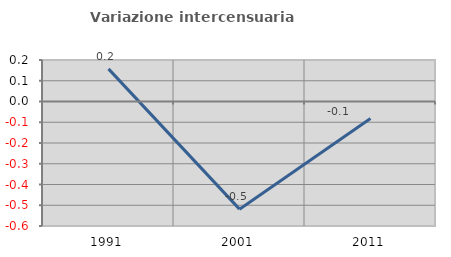
| Category | Variazione intercensuaria annua |
|---|---|
| 1991.0 | 0.157 |
| 2001.0 | -0.519 |
| 2011.0 | -0.082 |